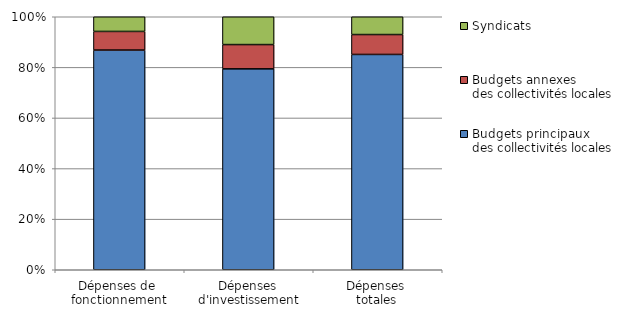
| Category | Budgets principaux 
des collectivités locales 
 | Budgets annexes 
des collectivités locales 
 | Syndicats |
|---|---|---|---|
| Dépenses de 
fonctionnement | 168.605 | 14.303 | 11.264 |
| Dépenses 
d'investissement | 45.49 | 5.499 | 6.298 |
| Dépenses 
totales | 214.095 | 19.802 | 17.689 |